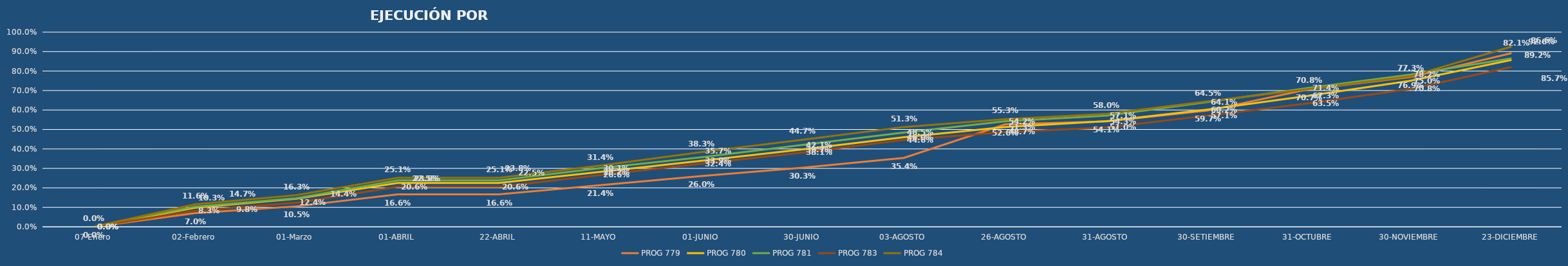
| Category | PROG 779 | PROG 780 | PROG 781 | PROG 783 | PROG 784 |
|---|---|---|---|---|---|
| 07-Enero | 0 | 0 | 0 | 0 | 0 |
| 02-Febrero | 0.07 | 0.098 | 0.103 | 0.083 | 0.116 |
| 01-Marzo | 0.105 | 0.144 | 0.147 | 0.124 | 0.163 |
| 01-ABRIL | 0.166 | 0.225 | 0.238 | 0.206 | 0.251 |
| 22-ABRIL | 0.166 | 0.225 | 0.238 | 0.206 | 0.251 |
| 11-MAYO | 0.214 | 0.282 | 0.301 | 0.266 | 0.314 |
| 01-JUNIO | 0.26 | 0.339 | 0.357 | 0.324 | 0.383 |
| 30-JUNIO | 0.303 | 0.397 | 0.421 | 0.381 | 0.447 |
| 03-AGOSTO | 0.354 | 0.46 | 0.485 | 0.446 | 0.513 |
| 26-AGOSTO | 0.526 | 0.513 | 0.542 | 0.487 | 0.553 |
| 31-AGOSTO | 0.541 | 0.543 | 0.571 | 0.51 | 0.58 |
| 30-SETIEMBRE | 0.597 | 0.602 | 0.641 | 0.571 | 0.645 |
| 31-OCTUBRE | 0.707 | 0.673 | 0.714 | 0.635 | 0.708 |
| 30-NOVIEMBRE | 0.769 | 0.75 | 0.782 | 0.708 | 0.773 |
| 23-DICIEMBRE | 0.892 | 0.857 | 0.866 | 0.821 | 0.926 |